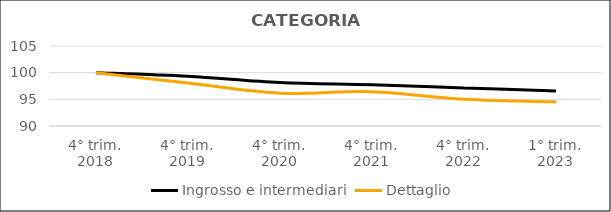
| Category | Ingrosso e intermediari | Dettaglio  |
|---|---|---|
| 4° trim.
2018 | 100 | 100 |
| 4° trim.
2019 | 99.318 | 98.045 |
| 4° trim.
2020 | 98.14 | 96.146 |
| 4° trim.
2021 | 97.731 | 96.443 |
| 4° trim.
2022 | 97.146 | 95.007 |
| 1° trim.
2023 | 96.572 | 94.535 |